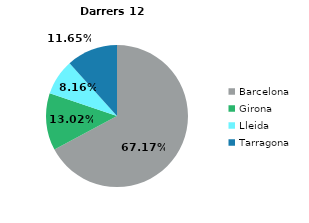
| Category | Acumulat any actual |
|---|---|
| Barcelona | 40237 |
| Girona | 7801 |
| Lleida | 4885 |
| Tarragona | 6977 |